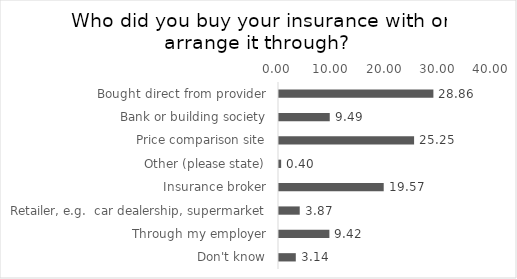
| Category | % of Respondents |
|---|---|
| Bought direct from provider | 28.858 |
| Bank or building society | 9.486 |
| Price comparison site | 25.251 |
| Other (please state) | 0.401 |
| Insurance broker | 19.572 |
| Retailer, e.g.  car dealership, supermarket | 3.874 |
| Through my employer | 9.419 |
| Don't know | 3.14 |